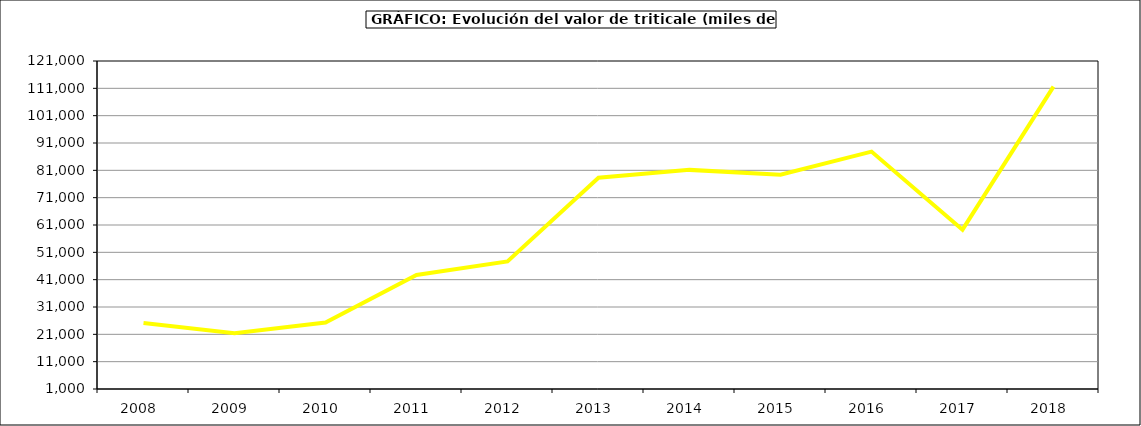
| Category | Producción |
|---|---|
| 2008.0 | 25178.261 |
| 2009.0 | 21396.86 |
| 2010.0 | 25344.427 |
| 2011.0 | 42728.352 |
| 2012.0 | 47678.033 |
| 2013.0 | 78279.322 |
| 2014.0 | 81166 |
| 2015.0 | 79377 |
| 2016.0 | 87859 |
| 2017.0 | 59282.944 |
| 2018.0 | 111629.892 |